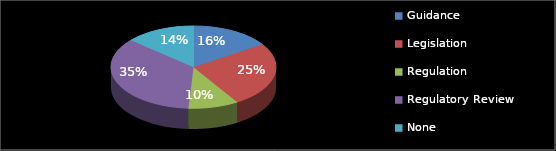
| Category | Series 0 |
|---|---|
| Guidance | 8 |
| Legislation | 13 |
| Regulation | 5 |
| Regulatory Review | 18 |
| None | 7 |